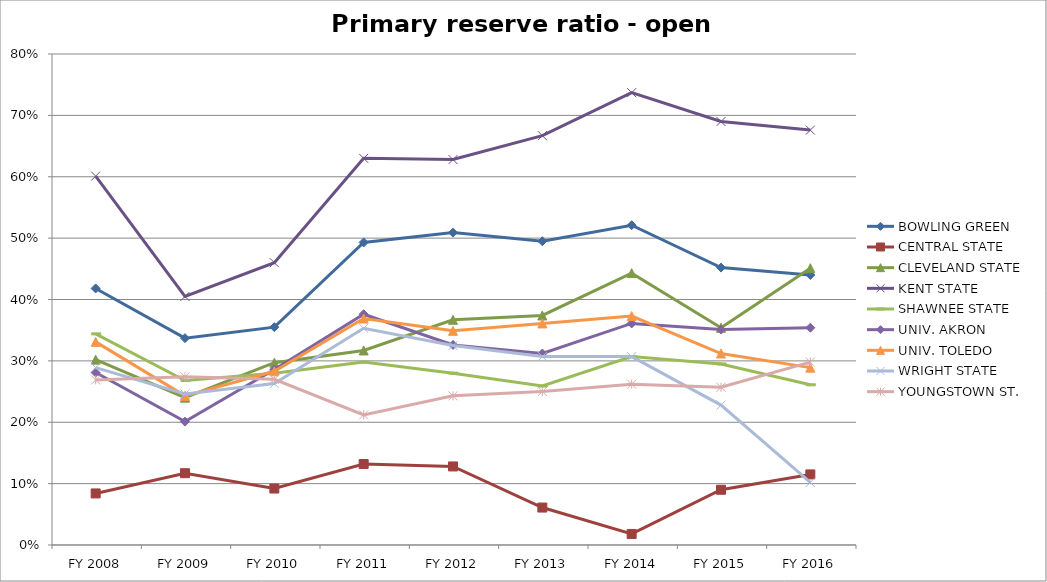
| Category | BOWLING GREEN  | CENTRAL STATE  | CLEVELAND STATE  | KENT STATE  | SHAWNEE STATE  | UNIV. AKRON  | UNIV. TOLEDO  | WRIGHT STATE  | YOUNGSTOWN ST.  |
|---|---|---|---|---|---|---|---|---|---|
| FY 2016 | 0.44 | 0.115 | 0.451 | 0.676 | 0.261 | 0.354 | 0.289 | 0.102 | 0.298 |
| FY 2015 | 0.452 | 0.09 | 0.354 | 0.69 | 0.295 | 0.351 | 0.312 | 0.228 | 0.257 |
| FY 2014 | 0.521 | 0.018 | 0.443 | 0.737 | 0.307 | 0.361 | 0.373 | 0.307 | 0.262 |
| FY 2013 | 0.495 | 0.061 | 0.374 | 0.667 | 0.259 | 0.312 | 0.361 | 0.307 | 0.25 |
| FY 2012 | 0.509 | 0.128 | 0.367 | 0.628 | 0.28 | 0.326 | 0.349 | 0.325 | 0.243 |
| FY 2011 | 0.493 | 0.132 | 0.317 | 0.63 | 0.298 | 0.376 | 0.369 | 0.353 | 0.212 |
| FY 2010 | 0.355 | 0.092 | 0.297 | 0.46 | 0.28 | 0.286 | 0.283 | 0.263 | 0.27 |
| FY 2009 | 0.337 | 0.117 | 0.24 | 0.405 | 0.268 | 0.201 | 0.243 | 0.246 | 0.274 |
| FY 2008 | 0.418 | 0.084 | 0.302 | 0.601 | 0.344 | 0.281 | 0.331 | 0.289 | 0.269 |